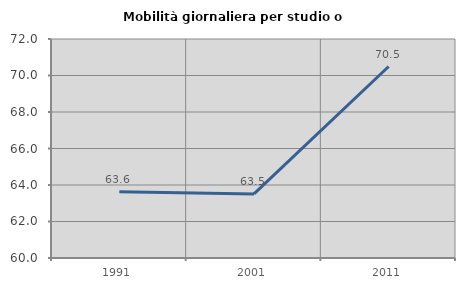
| Category | Mobilità giornaliera per studio o lavoro |
|---|---|
| 1991.0 | 63.636 |
| 2001.0 | 63.51 |
| 2011.0 | 70.491 |